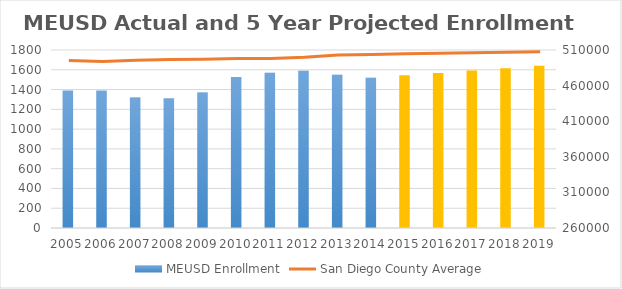
| Category | MEUSD Enrollment |
|---|---|
| 2005.0 | 1391 |
| 2006.0 | 1391 |
| 2007.0 | 1319 |
| 2008.0 | 1311 |
| 2009.0 | 1369 |
| 2010.0 | 1527 |
| 2011.0 | 1571 |
| 2012.0 | 1590 |
| 2013.0 | 1549 |
| 2014.0 | 1520 |
| 2015.0 | 1544 |
| 2016.0 | 1568 |
| 2017.0 | 1592 |
| 2018.0 | 1616 |
| 2019.0 | 1640 |